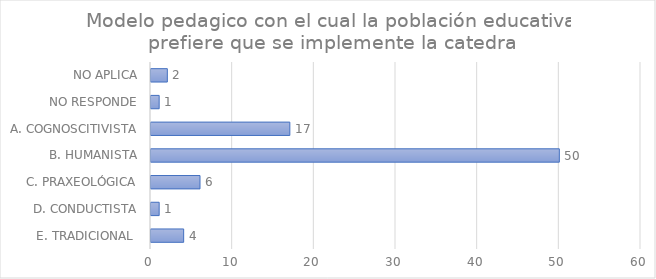
| Category | Series 0 |
|---|---|
| E. TRADICIONAL  | 4 |
| D. CONDUCTISTA | 1 |
| C. PRAXEOLÓGICA | 6 |
| B. HUMANISTA | 50 |
| A. COGNOSCITIVISTA | 17 |
| NO RESPONDE | 1 |
| NO APLICA | 2 |